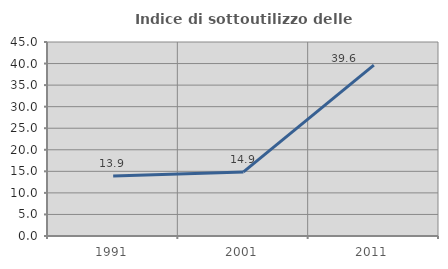
| Category | Indice di sottoutilizzo delle abitazioni  |
|---|---|
| 1991.0 | 13.923 |
| 2001.0 | 14.867 |
| 2011.0 | 39.634 |